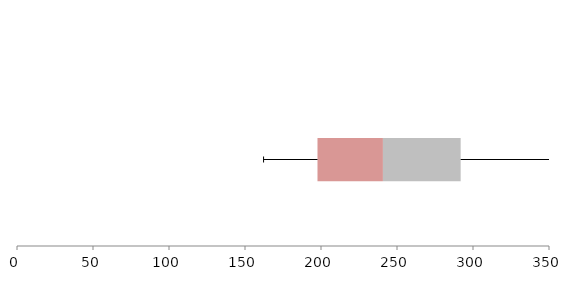
| Category | Series 1 | Series 2 | Series 3 |
|---|---|---|---|
| 0 | 197.69 | 43.052 | 51.142 |